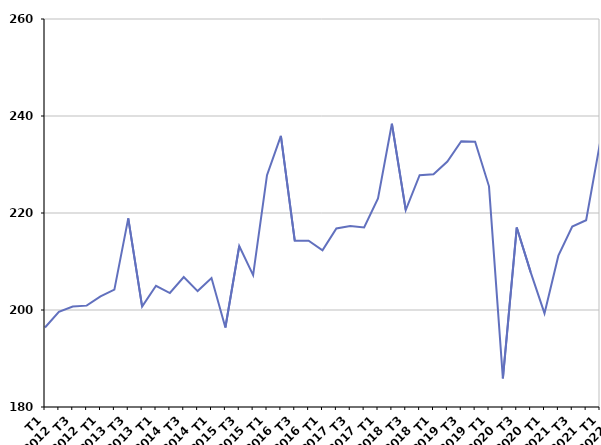
| Category | Cessation d'inscription pour défaut d'actualisation |
|---|---|
| T1
2012 | 196.4 |
| T2
2012 | 199.6 |
| T3
2012 | 200.7 |
| T4
2012 | 200.9 |
| T1
2013 | 202.8 |
| T2
2013 | 204.2 |
| T3
2013 | 218.9 |
| T4
2013 | 200.7 |
| T1
2014 | 205 |
| T2
2014 | 203.5 |
| T3
2014 | 206.8 |
| T4
2014 | 203.9 |
| T1
2015 | 206.6 |
| T2
2015 | 196.4 |
| T3
2015 | 213.2 |
| T4
2015 | 207.2 |
| T1
2016 | 227.8 |
| T2
2016 | 235.9 |
| T3
2016 | 214.3 |
| T4
2016 | 214.3 |
| T1
2017 | 212.3 |
| T2
2017 | 216.8 |
| T3
2017 | 217.3 |
| T4
2017 | 217 |
| T1
2018 | 223 |
| T2
2018 | 238.4 |
| T3
2018 | 220.6 |
| T4
2018 | 227.8 |
| T1
2019 | 228 |
| T2
2019 | 230.6 |
| T3
2019 | 234.8 |
| T4
2019 | 234.7 |
| T1
2020 | 225.5 |
| T2
2020 | 185.9 |
| T3
2020 | 217 |
| T4
2020 | 207.8 |
| T1
2021 | 199.3 |
| T2
2021 | 211.2 |
| T3
2021 | 217.2 |
| T4
2021 | 218.5 |
| T1
2022 | 234.4 |